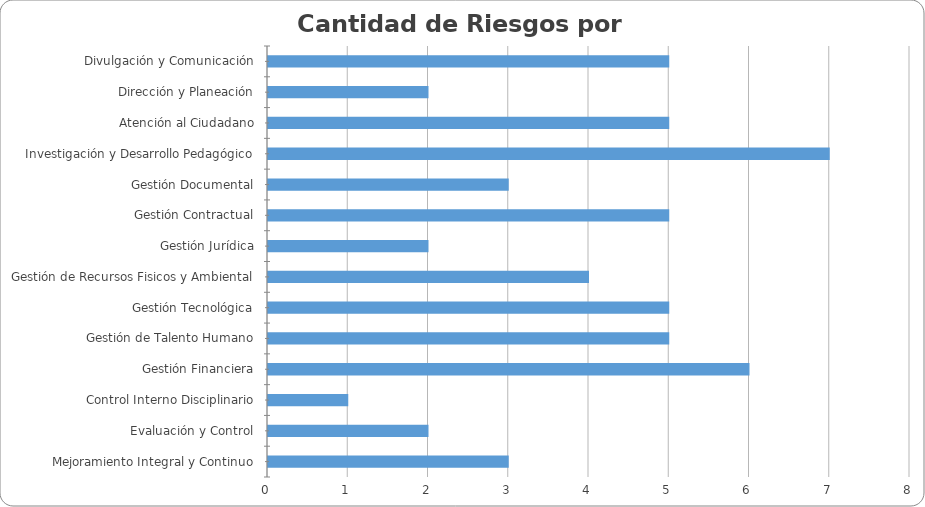
| Category | Series 0 |
|---|---|
| Divulgación y Comunicación | 5 |
| Dirección y Planeación | 2 |
| Atención al Ciudadano | 5 |
| Investigación y Desarrollo Pedagógico | 7 |
| Gestión Documental | 3 |
| Gestión Contractual | 5 |
| Gestión Jurídica | 2 |
| Gestión de Recursos Fisicos y Ambiental | 4 |
| Gestión Tecnológica | 5 |
| Gestión de Talento Humano | 5 |
| Gestión Financiera | 6 |
| Control Interno Disciplinario | 1 |
| Evaluación y Control | 2 |
| Mejoramiento Integral y Continuo | 3 |